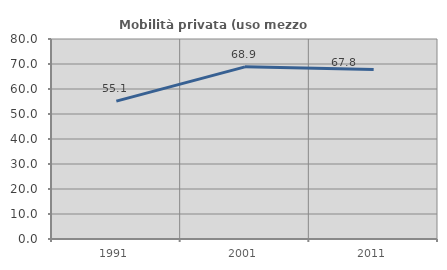
| Category | Mobilità privata (uso mezzo privato) |
|---|---|
| 1991.0 | 55.14 |
| 2001.0 | 68.86 |
| 2011.0 | 67.78 |